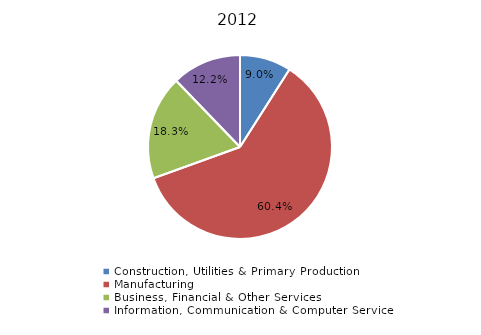
| Category | 2012 |
|---|---|
| Construction, Utilities & Primary Production  | 0.09 |
| Manufacturing  | 0.604 |
| Business, Financial & Other Services | 0.183 |
| Information, Communication & Computer Services | 0.122 |